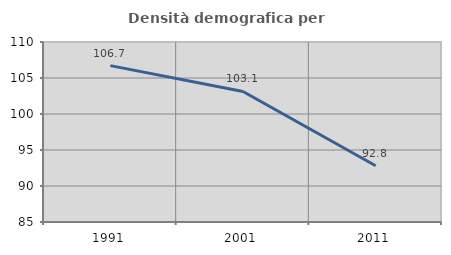
| Category | Densità demografica |
|---|---|
| 1991.0 | 106.717 |
| 2001.0 | 103.13 |
| 2011.0 | 92.817 |